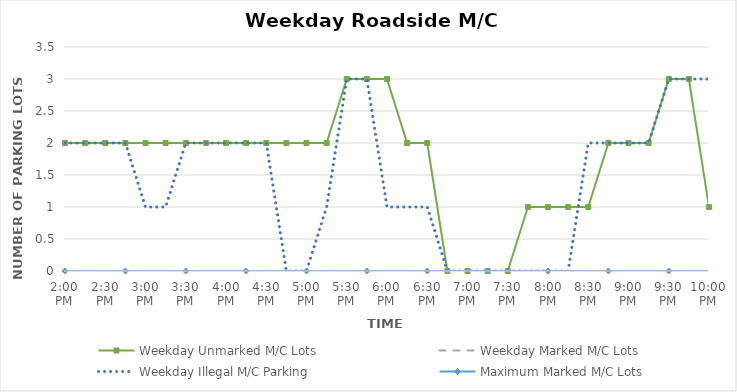
| Category | Weekday Unmarked M/C Lots | Weekday Marked M/C Lots | Weekday Illegal M/C Parking | Maximum Marked M/C Lots |
|---|---|---|---|---|
| 0.5833333333333334 | 2 | 0 | 2 | 0 |
| 0.59375 | 2 | 0 | 2 | 0 |
| 0.604166666666667 | 2 | 0 | 2 | 0 |
| 0.614583333333334 | 2 | 0 | 2 | 0 |
| 0.625 | 2 | 0 | 1 | 0 |
| 0.635416666666667 | 2 | 0 | 1 | 0 |
| 0.645833333333334 | 2 | 0 | 2 | 0 |
| 0.656250000000001 | 2 | 0 | 2 | 0 |
| 0.666666666666667 | 2 | 0 | 2 | 0 |
| 0.677083333333334 | 2 | 0 | 2 | 0 |
| 0.687500000000001 | 2 | 0 | 2 | 0 |
| 0.697916666666668 | 2 | 0 | 0 | 0 |
| 0.708333333333335 | 2 | 0 | 0 | 0 |
| 0.718750000000001 | 2 | 0 | 1 | 0 |
| 0.729166666666668 | 3 | 0 | 3 | 0 |
| 0.739583333333335 | 3 | 0 | 3 | 0 |
| 0.750000000000002 | 3 | 0 | 1 | 0 |
| 0.760416666666668 | 2 | 0 | 1 | 0 |
| 0.770833333333335 | 2 | 0 | 1 | 0 |
| 0.781250000000002 | 0 | 0 | 0 | 0 |
| 0.791666666666669 | 0 | 0 | 0 | 0 |
| 0.802083333333335 | 0 | 0 | 0 | 0 |
| 0.812500000000002 | 0 | 0 | 0 | 0 |
| 0.822916666666669 | 1 | 0 | 0 | 0 |
| 0.833333333333336 | 1 | 0 | 0 | 0 |
| 0.843750000000002 | 1 | 0 | 0 | 0 |
| 0.854166666666669 | 1 | 0 | 2 | 0 |
| 0.864583333333336 | 2 | 0 | 2 | 0 |
| 0.875000000000002 | 2 | 0 | 2 | 0 |
| 0.885416666666669 | 2 | 0 | 2 | 0 |
| 0.895833333333336 | 3 | 0 | 3 | 0 |
| 0.906250000000003 | 3 | 0 | 3 | 0 |
| 0.916666666666669 | 1 | 0 | 3 | 0 |